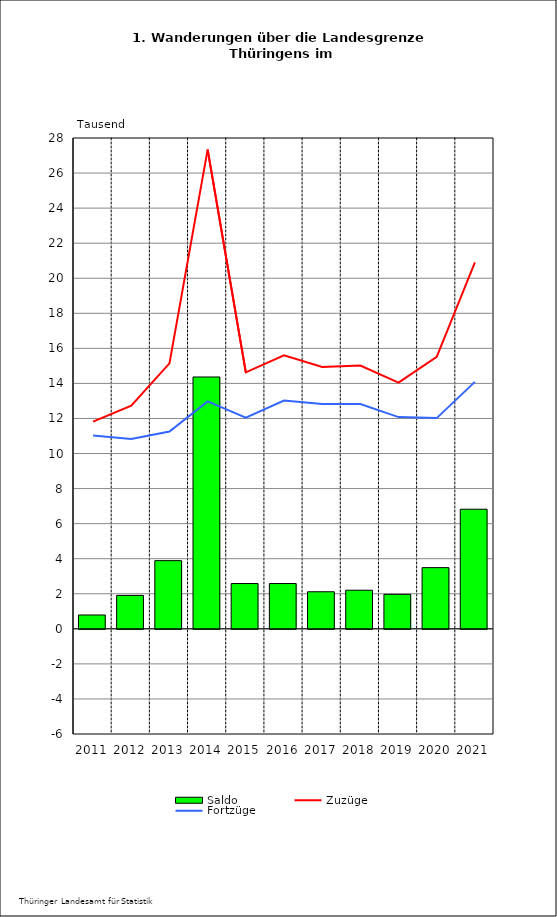
| Category | Saldo |
|---|---|
| 2011.0 | 0.79 |
| 2012.0 | 1.906 |
| 2013.0 | 3.889 |
| 2014.0 | 14.366 |
| 2015.0 | 2.583 |
| 2016.0 | 2.583 |
| 2017.0 | 2.114 |
| 2018.0 | 2.202 |
| 2019.0 | 1.967 |
| 2020.0 | 3.491 |
| 2021.0 | 6.823 |